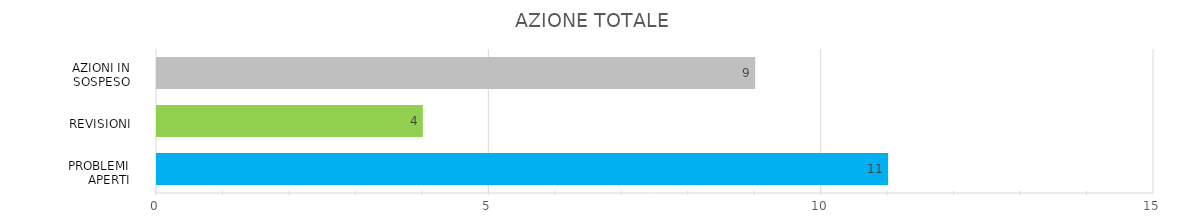
| Category | Series 0 |
|---|---|
| 0 | 11 |
| 1 | 4 |
| 2 | 9 |